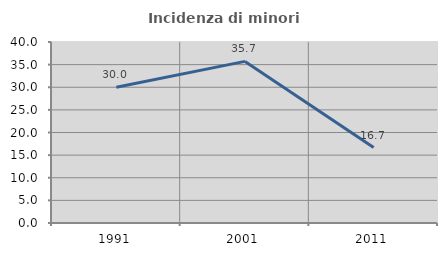
| Category | Incidenza di minori stranieri |
|---|---|
| 1991.0 | 30 |
| 2001.0 | 35.714 |
| 2011.0 | 16.667 |